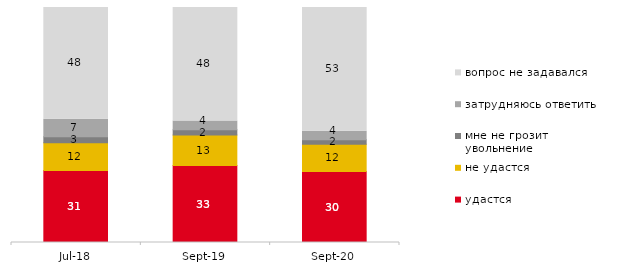
| Category | удастся | не удастся | мне не грозит увольнение | затрудняюсь ответить | вопрос не задавался |
|---|---|---|---|---|---|
| 2018-07-01 | 30.6 | 11.85 | 2.6 | 7.4 | 47.55 |
| 2019-09-01 | 32.723 | 12.97 | 2.327 | 3.663 | 48.317 |
| 2020-09-01 | 30.164 | 11.697 | 1.891 | 3.584 | 52.663 |